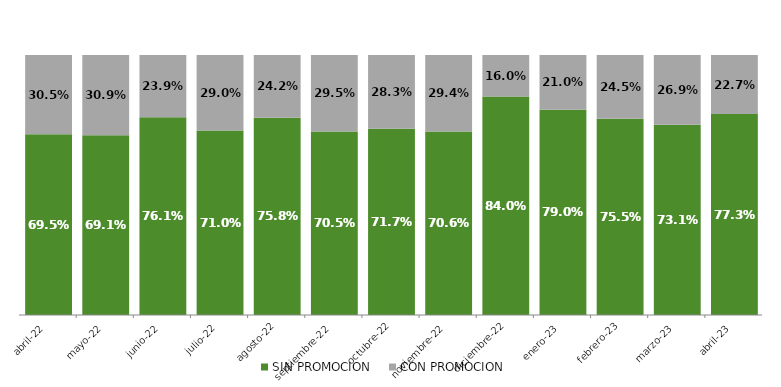
| Category | SIN PROMOCION   | CON PROMOCION   |
|---|---|---|
| 2022-04-01 | 0.695 | 0.305 |
| 2022-05-01 | 0.691 | 0.309 |
| 2022-06-01 | 0.761 | 0.239 |
| 2022-07-01 | 0.71 | 0.29 |
| 2022-08-01 | 0.758 | 0.242 |
| 2022-09-01 | 0.705 | 0.295 |
| 2022-10-01 | 0.717 | 0.283 |
| 2022-11-01 | 0.706 | 0.294 |
| 2022-12-01 | 0.84 | 0.16 |
| 2023-01-01 | 0.79 | 0.21 |
| 2023-02-01 | 0.755 | 0.245 |
| 2023-03-01 | 0.731 | 0.269 |
| 2023-04-01 | 0.773 | 0.227 |